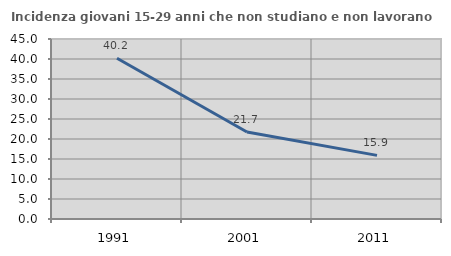
| Category | Incidenza giovani 15-29 anni che non studiano e non lavorano  |
|---|---|
| 1991.0 | 40.179 |
| 2001.0 | 21.739 |
| 2011.0 | 15.909 |